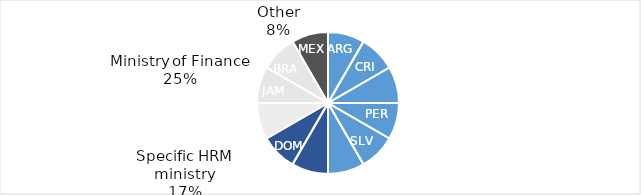
| Category | Series 0 |
|---|---|
| ARG | 1 |
| CRI | 1 |
| GTM | 1 |
| PER | 1 |
| SLV | 1 |
| URY | 1 |
| COL | 1 |
| DOM | 1 |
| CHL | 1 |
| JAM | 1 |
| BRA | 1 |
| MEX | 1 |